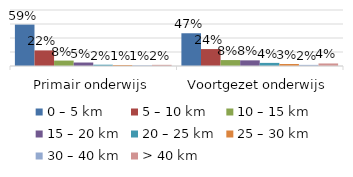
| Category | 0 – 5 km | 5 – 10 km | 10 – 15 km | 15 – 20 km | 20 – 25 km | 25 – 30 km | 30 – 40 km | > 40 km |
|---|---|---|---|---|---|---|---|---|
| Primair onderwijs | 0.591 | 0.223 | 0.077 | 0.05 | 0.018 | 0.015 | 0.009 | 0.017 |
| Voortgezet onderwijs | 0.468 | 0.242 | 0.085 | 0.081 | 0.044 | 0.028 | 0.016 | 0.036 |